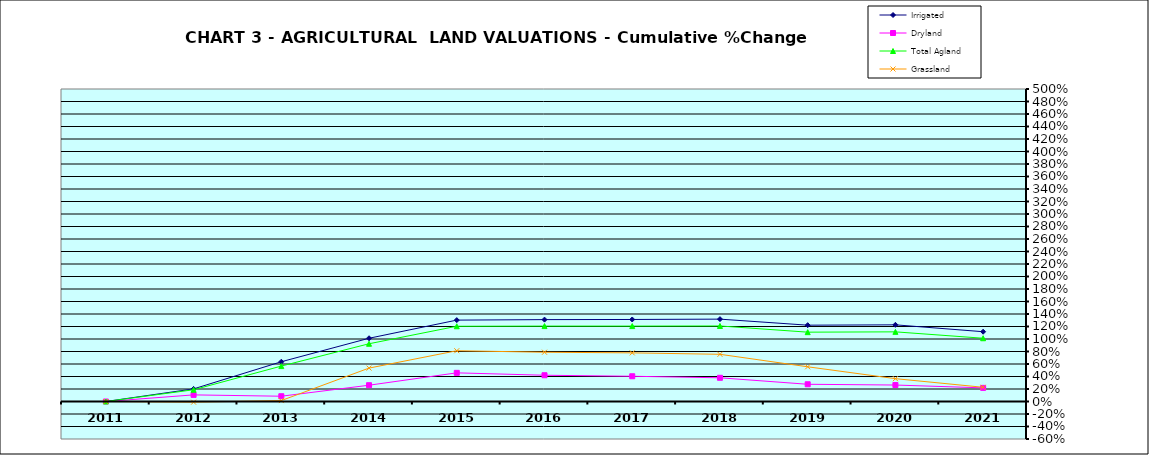
| Category | Irrigated | Dryland | Total Agland | Grassland |
|---|---|---|---|---|
| 2011.0 | 0 | 0 | 0 | 0 |
| 2012.0 | 0.202 | 0.106 | 0.188 | -0.01 |
| 2013.0 | 0.636 | 0.084 | 0.567 | 0.015 |
| 2014.0 | 1.012 | 0.261 | 0.924 | 0.535 |
| 2015.0 | 1.302 | 0.458 | 1.204 | 0.812 |
| 2016.0 | 1.31 | 0.42 | 1.207 | 0.788 |
| 2017.0 | 1.312 | 0.404 | 1.207 | 0.778 |
| 2018.0 | 1.318 | 0.379 | 1.209 | 0.755 |
| 2019.0 | 1.221 | 0.276 | 1.109 | 0.555 |
| 2020.0 | 1.227 | 0.263 | 1.114 | 0.365 |
| 2021.0 | 1.117 | 0.218 | 1.012 | 0.227 |